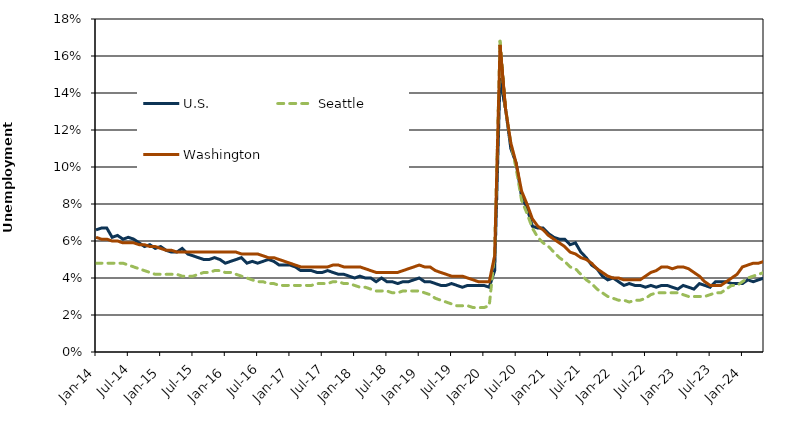
| Category | U.S. | Seattle | Washington |
|---|---|---|---|
| Jan-14 | 0.066 | 0.048 | 0.062 |
| Feb-14 | 0.067 | 0.048 | 0.061 |
| Mar-14 | 0.067 | 0.048 | 0.061 |
| Apr-14 | 0.062 | 0.048 | 0.06 |
| May-14 | 0.063 | 0.048 | 0.06 |
| Jun-14 | 0.061 | 0.048 | 0.059 |
| Jul-14 | 0.062 | 0.047 | 0.059 |
| Aug-14 | 0.061 | 0.046 | 0.059 |
| Sep-14 | 0.059 | 0.045 | 0.058 |
| Oct-14 | 0.057 | 0.044 | 0.058 |
| Nov-14 | 0.058 | 0.043 | 0.057 |
| Dec-14 | 0.056 | 0.042 | 0.057 |
| Jan-15 | 0.057 | 0.042 | 0.056 |
| Feb-15 | 0.055 | 0.042 | 0.055 |
| Mar-15 | 0.054 | 0.042 | 0.055 |
| Apr-15 | 0.054 | 0.042 | 0.054 |
| May-15 | 0.056 | 0.041 | 0.054 |
| Jun-15 | 0.053 | 0.041 | 0.054 |
| Jul-15 | 0.052 | 0.041 | 0.054 |
| Aug-15 | 0.051 | 0.042 | 0.054 |
| Sep-15 | 0.05 | 0.043 | 0.054 |
| Oct-15 | 0.05 | 0.043 | 0.054 |
| Nov-15 | 0.051 | 0.044 | 0.054 |
| Dec-15 | 0.05 | 0.044 | 0.054 |
| Jan-16 | 0.048 | 0.043 | 0.054 |
| Feb-16 | 0.049 | 0.043 | 0.054 |
| Mar-16 | 0.05 | 0.042 | 0.054 |
| Apr-16 | 0.051 | 0.041 | 0.053 |
| May-16 | 0.048 | 0.04 | 0.053 |
| Jun-16 | 0.049 | 0.039 | 0.053 |
| Jul-16 | 0.048 | 0.038 | 0.053 |
| Aug-16 | 0.049 | 0.038 | 0.052 |
| Sep-16 | 0.05 | 0.037 | 0.051 |
| Oct-16 | 0.049 | 0.037 | 0.051 |
| Nov-16 | 0.047 | 0.036 | 0.05 |
| Dec-16 | 0.047 | 0.036 | 0.049 |
| Jan-17 | 0.047 | 0.036 | 0.048 |
| Feb-17 | 0.046 | 0.036 | 0.047 |
| Mar-17 | 0.044 | 0.036 | 0.046 |
| Apr-17 | 0.044 | 0.036 | 0.046 |
| May-17 | 0.044 | 0.036 | 0.046 |
| Jun-17 | 0.043 | 0.037 | 0.046 |
| Jul-17 | 0.043 | 0.037 | 0.046 |
| Aug-17 | 0.044 | 0.037 | 0.046 |
| Sep-17 | 0.043 | 0.038 | 0.047 |
| Oct-17 | 0.042 | 0.038 | 0.047 |
| Nov-17 | 0.042 | 0.037 | 0.046 |
| Dec-17 | 0.041 | 0.037 | 0.046 |
| Jan-18 | 0.04 | 0.036 | 0.046 |
| Feb-18 | 0.041 | 0.035 | 0.046 |
| Mar-18 | 0.04 | 0.035 | 0.045 |
| Apr-18 | 0.04 | 0.034 | 0.044 |
| May-18 | 0.038 | 0.033 | 0.043 |
| Jun-18 | 0.04 | 0.033 | 0.043 |
| Jul-18 | 0.038 | 0.033 | 0.043 |
| Aug-18 | 0.038 | 0.032 | 0.043 |
| Sep-18 | 0.037 | 0.032 | 0.043 |
| Oct-18 | 0.038 | 0.033 | 0.044 |
| Nov-18 | 0.038 | 0.033 | 0.045 |
| Dec-18 | 0.039 | 0.033 | 0.046 |
| Jan-19 | 0.04 | 0.033 | 0.047 |
| Feb-19 | 0.038 | 0.032 | 0.046 |
| Mar-19 | 0.038 | 0.031 | 0.046 |
| Apr-19 | 0.037 | 0.029 | 0.044 |
| May-19 | 0.036 | 0.028 | 0.043 |
| Jun-19 | 0.036 | 0.027 | 0.042 |
| Jul-19 | 0.037 | 0.026 | 0.041 |
| Aug-19 | 0.036 | 0.025 | 0.041 |
| Sep-19 | 0.035 | 0.025 | 0.041 |
| Oct-19 | 0.036 | 0.025 | 0.04 |
| Nov-19 | 0.036 | 0.024 | 0.039 |
| Dec-19 | 0.036 | 0.024 | 0.038 |
| Jan-20 | 0.036 | 0.024 | 0.038 |
| Feb-20 | 0.035 | 0.025 | 0.038 |
| Mar-20 | 0.044 | 0.053 | 0.052 |
| Apr-20 | 0.148 | 0.168 | 0.166 |
| May-20 | 0.132 | 0.132 | 0.132 |
| Jun-20 | 0.11 | 0.113 | 0.113 |
| Jul-20 | 0.102 | 0.099 | 0.102 |
| Aug-20 | 0.084 | 0.082 | 0.087 |
| Sep-20 | 0.078 | 0.075 | 0.08 |
| Oct-20 | 0.068 | 0.067 | 0.072 |
| Nov-20 | 0.067 | 0.062 | 0.068 |
| Dec-20 | 0.067 | 0.059 | 0.066 |
| Jan-21 | 0.064 | 0.057 | 0.063 |
| Feb-21 | 0.062 | 0.054 | 0.061 |
| Mar-21 | 0.061 | 0.051 | 0.059 |
| Apr-21 | 0.061 | 0.049 | 0.057 |
| May-21 | 0.058 | 0.046 | 0.054 |
| Jun-21 | 0.059 | 0.045 | 0.053 |
| Jul-21 | 0.054 | 0.042 | 0.051 |
| Aug-21 | 0.051 | 0.039 | 0.05 |
| Sep-21 | 0.047 | 0.037 | 0.048 |
| Oct-21 | 0.045 | 0.034 | 0.045 |
| Nov-21 | 0.041 | 0.032 | 0.043 |
| Dec-21 | 0.039 | 0.03 | 0.041 |
| Jan-22 | 0.04 | 0.029 | 0.04 |
| Feb-22 | 0.038 | 0.028 | 0.04 |
| Mar-22 | 0.036 | 0.028 | 0.039 |
| Apr-22 | 0.037 | 0.027 | 0.039 |
| May-22 | 0.036 | 0.028 | 0.039 |
| Jun-22 | 0.036 | 0.028 | 0.039 |
| Jul-22 | 0.035 | 0.029 | 0.041 |
| Aug-22 | 0.036 | 0.031 | 0.043 |
| Sep-22 | 0.035 | 0.032 | 0.044 |
| Oct-22 | 0.036 | 0.032 | 0.046 |
| Nov-22 | 0.036 | 0.032 | 0.046 |
| Dec-22 | 0.035 | 0.032 | 0.045 |
| Jan-23 | 0.034 | 0.032 | 0.046 |
| Feb-23 | 0.036 | 0.031 | 0.046 |
| Mar-23 | 0.035 | 0.03 | 0.045 |
| Apr-23 | 0.034 | 0.03 | 0.043 |
| May-23 | 0.037 | 0.03 | 0.041 |
| Jun-23 | 0.036 | 0.03 | 0.038 |
| Jul-23 | 0.035 | 0.031 | 0.036 |
| Aug-23 | 0.038 | 0.032 | 0.036 |
| Sep-23 | 0.038 | 0.032 | 0.036 |
| Oct-23 | 0.038 | 0.034 | 0.038 |
| Nov-23 | 0.037 | 0.036 | 0.04 |
| Dec-23 | 0.037 | 0.036 | 0.042 |
| Jan-24 | 0.037 | 0.038 | 0.046 |
| Feb-24 | 0.039 | 0.04 | 0.047 |
| Mar-24 | 0.038 | 0.041 | 0.048 |
| Apr-24 | 0.039 | 0.042 | 0.048 |
| May-24 | 0.04 | 0.043 | 0.049 |